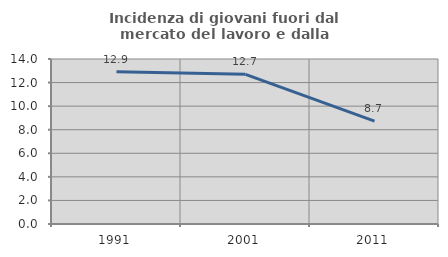
| Category | Incidenza di giovani fuori dal mercato del lavoro e dalla formazione  |
|---|---|
| 1991.0 | 12.927 |
| 2001.0 | 12.698 |
| 2011.0 | 8.723 |